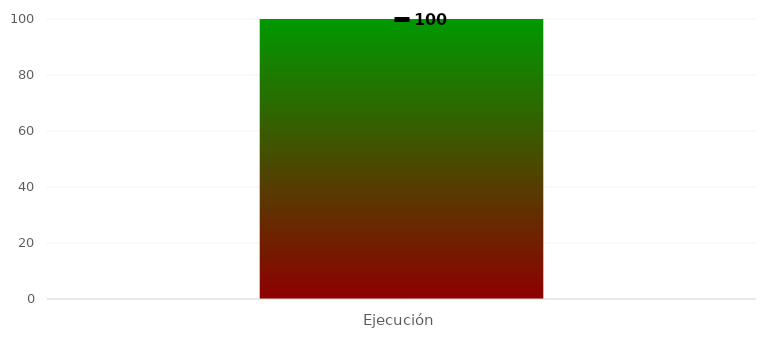
| Category | Niveles |
|---|---|
| Ejecución | 100 |